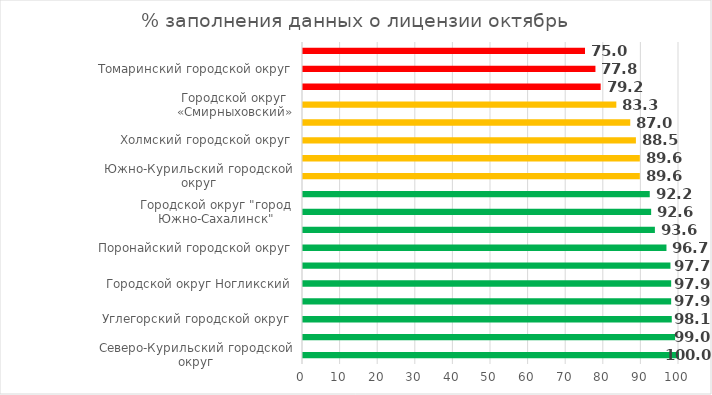
| Category | Series 0 |
|---|---|
| Северо-Курильский городской округ | 100 |
| Невельский городской округ | 98.958 |
| Углегорский городской округ | 98.077 |
| Городской округ «Александровск-Сахалинский район»  | 97.917 |
| Городской округ Ногликский | 97.917 |
| Городской округ «Долинский» | 97.727 |
| Поронайский городской округ | 96.667 |
| Тымовский городской округ | 93.59 |
| Городской округ "город Южно-Сахалинск" | 92.593 |
| Корсаковский городской округ | 92.222 |
| Южно-Курильский городской округ | 89.583 |
| Анивский городской округ | 89.583 |
| Холмский городской округ | 88.542 |
| Городской округ«Охинский» | 87.037 |
| Городской округ «Смирныховский» | 83.333 |
| Курильский городской округ | 79.167 |
| Томаринский городской округ | 77.778 |
| Макаровский городской округ | 75 |